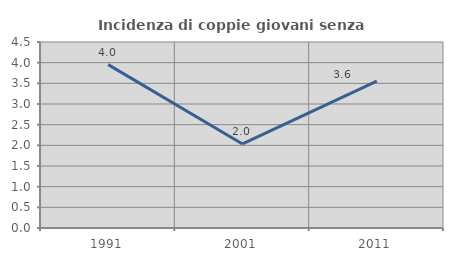
| Category | Incidenza di coppie giovani senza figli |
|---|---|
| 1991.0 | 3.952 |
| 2001.0 | 2.034 |
| 2011.0 | 3.554 |